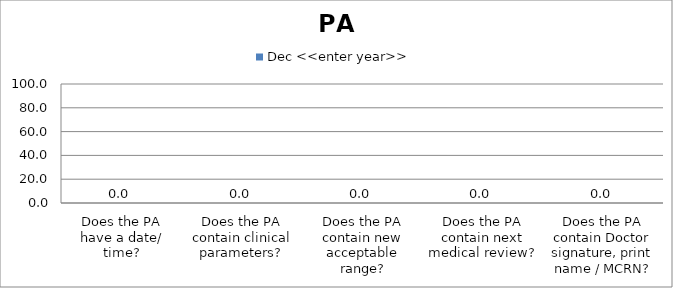
| Category | Dec <<enter year>> |
|---|---|
| Does the PA have a date/ time? | 0 |
| Does the PA contain clinical parameters? | 0 |
| Does the PA contain new acceptable range? | 0 |
| Does the PA contain next medical review? | 0 |
| Does the PA contain Doctor signature, print name / MCRN? | 0 |